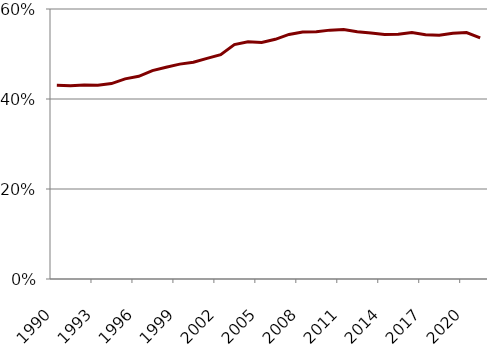
| Category | Series 0 |
|---|---|
| 1990-03-01 | 0.43 |
| 1991-03-01 | 0.429 |
| 1992-03-01 | 0.431 |
| 1993-03-01 | 0.431 |
| 1994-03-01 | 0.434 |
| 1995-03-01 | 0.445 |
| 1996-03-01 | 0.45 |
| 1997-03-01 | 0.463 |
| 1998-03-01 | 0.471 |
| 1999-03-01 | 0.477 |
| 2000-03-01 | 0.482 |
| 2001-03-01 | 0.49 |
| 2002-03-01 | 0.499 |
| 2003-03-01 | 0.521 |
| 2004-03-01 | 0.527 |
| 2005-03-01 | 0.526 |
| 2006-03-01 | 0.533 |
| 2007-03-01 | 0.543 |
| 2008-03-01 | 0.549 |
| 2009-03-01 | 0.549 |
| 2010-03-01 | 0.553 |
| 2011-03-01 | 0.554 |
| 2012-03-01 | 0.55 |
| 2013-03-01 | 0.547 |
| 2014-03-01 | 0.543 |
| 2015-03-01 | 0.544 |
| 2016-03-01 | 0.548 |
| 2017-03-01 | 0.543 |
| 2018-03-01 | 0.542 |
| 2019-03-01 | 0.546 |
| 2020-03-01 | 0.548 |
| 2021-03-01 | 0.536 |